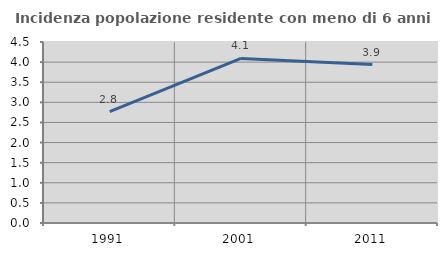
| Category | Incidenza popolazione residente con meno di 6 anni |
|---|---|
| 1991.0 | 2.769 |
| 2001.0 | 4.093 |
| 2011.0 | 3.94 |